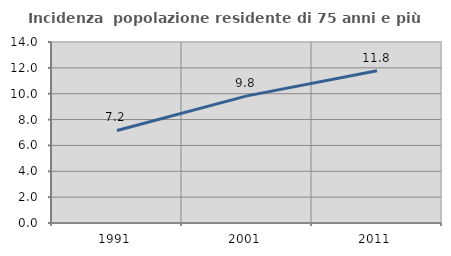
| Category | Incidenza  popolazione residente di 75 anni e più |
|---|---|
| 1991.0 | 7.16 |
| 2001.0 | 9.832 |
| 2011.0 | 11.777 |